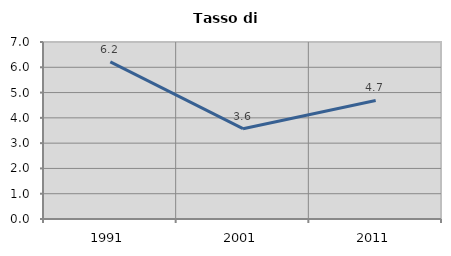
| Category | Tasso di disoccupazione   |
|---|---|
| 1991.0 | 6.215 |
| 2001.0 | 3.571 |
| 2011.0 | 4.688 |